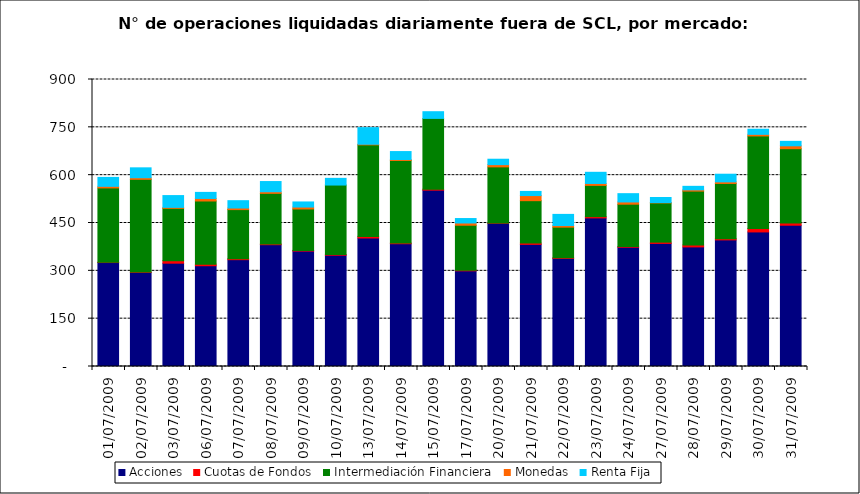
| Category | Acciones | Cuotas de Fondos | Intermediación Financiera | Monedas | Renta Fija |
|---|---|---|---|---|---|
| 01/07/2009 | 326 | 1 | 233 | 5 | 28 |
| 02/07/2009 | 295 | 1 | 291 | 5 | 31 |
| 03/07/2009 | 324 | 8 | 164 | 3 | 37 |
| 06/07/2009 | 316 | 5 | 198 | 8 | 19 |
| 07/07/2009 | 335 | 3 | 154 | 5 | 23 |
| 08/07/2009 | 382 | 2 | 159 | 5 | 32 |
| 09/07/2009 | 362 | 2 | 130 | 6 | 16 |
| 10/07/2009 | 349 | 2 | 218 | 0 | 21 |
| 13/07/2009 | 403 | 5 | 287 | 2 | 52 |
| 14/07/2009 | 385 | 2 | 259 | 3 | 25 |
| 15/07/2009 | 553 | 3 | 222 | 0 | 21 |
| 17/07/2009 | 300 | 2 | 141 | 7 | 14 |
| 20/07/2009 | 449 | 1 | 176 | 7 | 17 |
| 21/07/2009 | 383 | 4 | 133 | 16 | 13 |
| 22/07/2009 | 339 | 2 | 96 | 5 | 35 |
| 23/07/2009 | 466 | 4 | 98 | 6 | 35 |
| 24/07/2009 | 374 | 2 | 133 | 7 | 26 |
| 27/07/2009 | 386 | 4 | 123 | 1 | 16 |
| 28/07/2009 | 375 | 6 | 169 | 4 | 11 |
| 29/07/2009 | 397 | 4 | 173 | 5 | 24 |
| 30/07/2009 | 422 | 11 | 290 | 5 | 16 |
| 31/07/2009 | 443 | 7 | 233 | 9 | 14 |